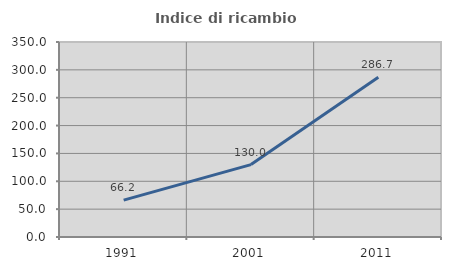
| Category | Indice di ricambio occupazionale  |
|---|---|
| 1991.0 | 66.176 |
| 2001.0 | 130 |
| 2011.0 | 286.667 |